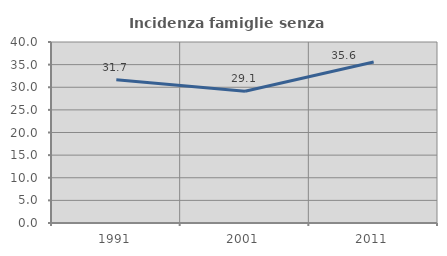
| Category | Incidenza famiglie senza nuclei |
|---|---|
| 1991.0 | 31.683 |
| 2001.0 | 29.128 |
| 2011.0 | 35.577 |